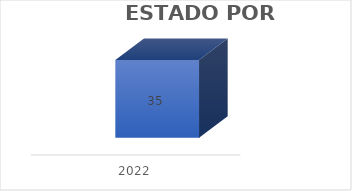
| Category | Comité de contratación |
|---|---|
| 2022 | 35 |